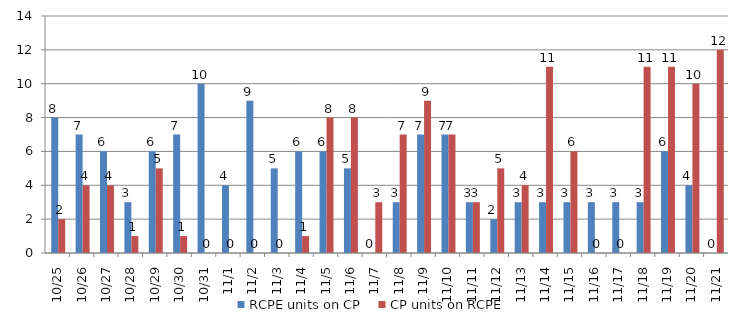
| Category | RCPE units on CP | CP units on RCPE |
|---|---|---|
| 2015-10-25 | 8 | 2 |
| 2015-10-26 | 7 | 4 |
| 2015-10-27 | 6 | 4 |
| 2015-10-28 | 3 | 1 |
| 2015-10-29 | 6 | 5 |
| 2015-10-30 | 7 | 1 |
| 2015-10-31 | 10 | 0 |
| 2015-11-01 | 4 | 0 |
| 2015-11-02 | 9 | 0 |
| 2015-11-03 | 5 | 0 |
| 2015-11-04 | 6 | 1 |
| 2015-11-05 | 6 | 8 |
| 2015-11-06 | 5 | 8 |
| 2015-11-07 | 0 | 3 |
| 2015-11-08 | 3 | 7 |
| 2015-11-09 | 7 | 9 |
| 2015-11-10 | 7 | 7 |
| 2015-11-11 | 3 | 3 |
| 2015-11-12 | 2 | 5 |
| 2015-11-13 | 3 | 4 |
| 2015-11-14 | 3 | 11 |
| 2015-11-15 | 3 | 6 |
| 2015-11-16 | 3 | 0 |
| 2015-11-17 | 3 | 0 |
| 2015-11-18 | 3 | 11 |
| 2015-11-19 | 6 | 11 |
| 2015-11-20 | 4 | 10 |
| 2015-11-21 | 0 | 12 |